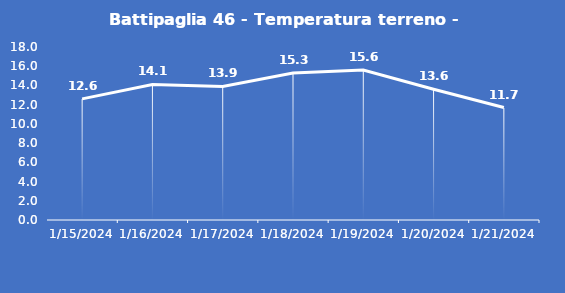
| Category | Battipaglia 46 - Temperatura terreno - Max (°C) |
|---|---|
| 1/15/24 | 12.6 |
| 1/16/24 | 14.1 |
| 1/17/24 | 13.9 |
| 1/18/24 | 15.3 |
| 1/19/24 | 15.6 |
| 1/20/24 | 13.6 |
| 1/21/24 | 11.7 |